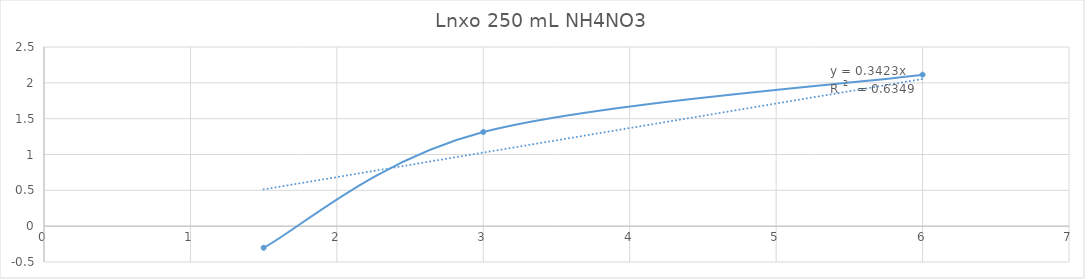
| Category | Lnxo |
|---|---|
| 1.5 | -0.301 |
| 3.0 | 1.314 |
| 6.0 | 2.114 |